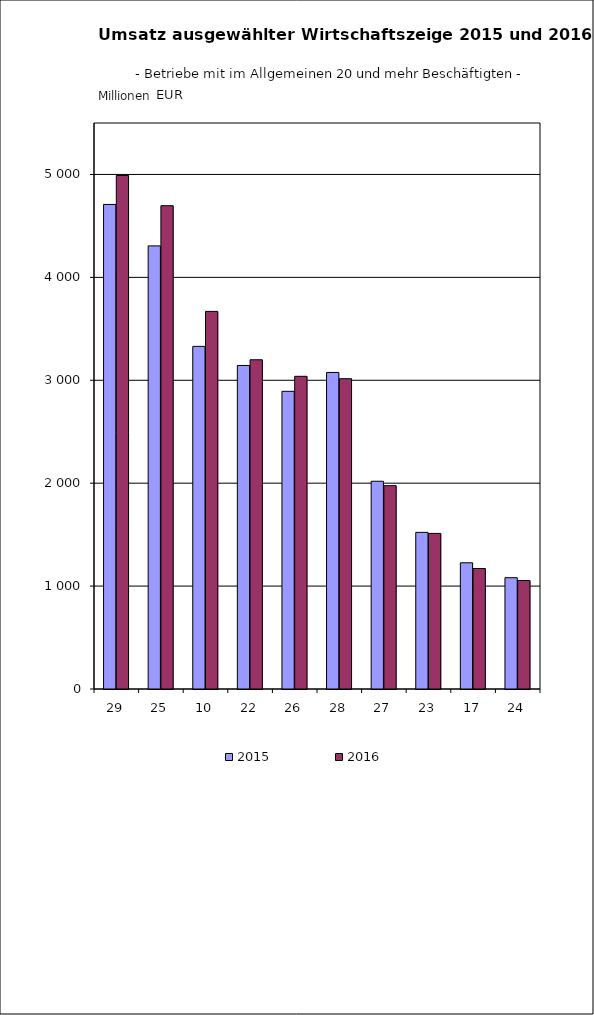
| Category | 2015 | 2016 |
|---|---|---|
| 0 | 4708.517 | 4990.317 |
| 1 | 4305.913 | 4696.496 |
| 2 | 3329.292 | 3669.256 |
| 3 | 3143.644 | 3199.393 |
| 4 | 2892.639 | 3038.528 |
| 5 | 3076.074 | 3015.32 |
| 6 | 2018.876 | 1975.846 |
| 7 | 1521.878 | 1511.985 |
| 8 | 1226.387 | 1170.847 |
| 9 | 1081.574 | 1053.981 |